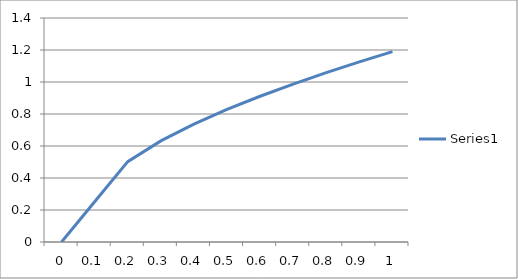
| Category | Series 0 |
|---|---|
| 0.0 | 0 |
| 0.1 | 0.251 |
| 0.2 | 0.502 |
| 0.3 | 0.632 |
| 0.4 | 0.737 |
| 0.5 | 0.828 |
| 0.6 | 0.911 |
| 0.7 | 0.987 |
| 0.7999999999999999 | 1.059 |
| 0.8999999999999999 | 1.126 |
| 0.9999999999999999 | 1.19 |